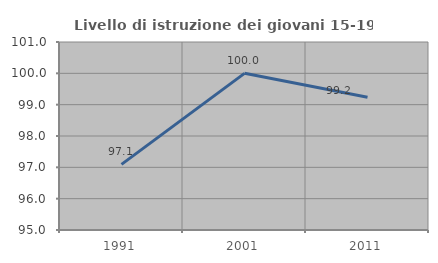
| Category | Livello di istruzione dei giovani 15-19 anni |
|---|---|
| 1991.0 | 97.095 |
| 2001.0 | 100 |
| 2011.0 | 99.237 |